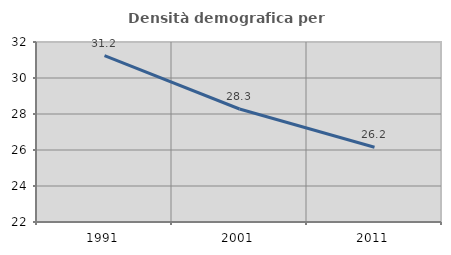
| Category | Densità demografica |
|---|---|
| 1991.0 | 31.244 |
| 2001.0 | 28.279 |
| 2011.0 | 26.15 |